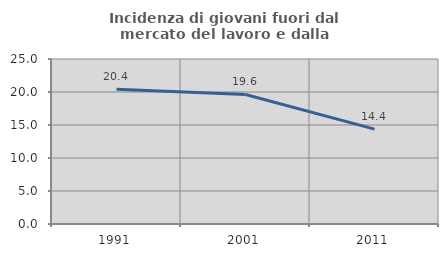
| Category | Incidenza di giovani fuori dal mercato del lavoro e dalla formazione  |
|---|---|
| 1991.0 | 20.417 |
| 2001.0 | 19.632 |
| 2011.0 | 14.368 |